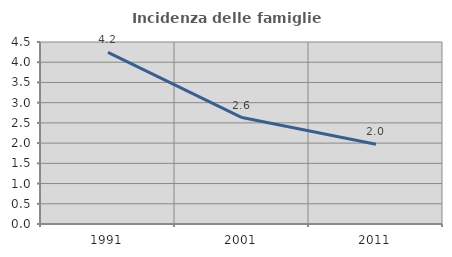
| Category | Incidenza delle famiglie numerose |
|---|---|
| 1991.0 | 4.245 |
| 2001.0 | 2.632 |
| 2011.0 | 1.974 |